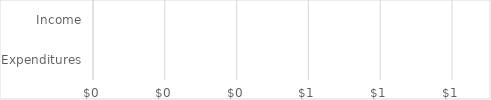
| Category | Annual Totals |
|---|---|
| Expenditures | 0 |
| Income | 0 |